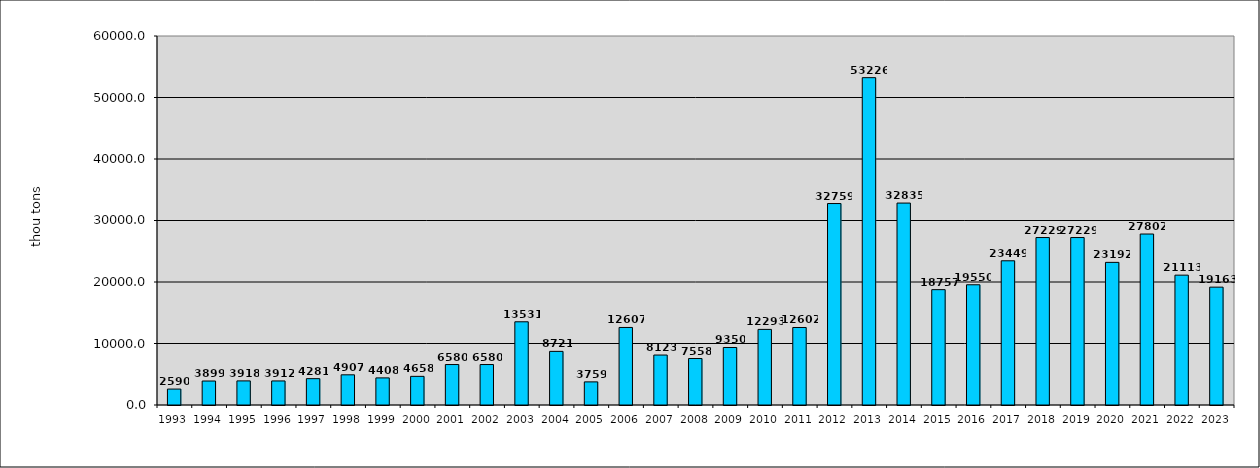
| Category | Series 0 |
|---|---|
| 1993.0 | 2590 |
| 1994.0 | 3899 |
| 1995.0 | 3918 |
| 1996.0 | 3912 |
| 1997.0 | 4281 |
| 1998.0 | 4907 |
| 1999.0 | 4408 |
| 2000.0 | 4658 |
| 2001.0 | 6580 |
| 2002.0 | 6580 |
| 2003.0 | 13531 |
| 2004.0 | 8721 |
| 2005.0 | 3759 |
| 2006.0 | 12607 |
| 2007.0 | 8123 |
| 2008.0 | 7558 |
| 2009.0 | 9350 |
| 2010.0 | 12293 |
| 2011.0 | 12602 |
| 2012.0 | 32759 |
| 2013.0 | 53226 |
| 2014.0 | 32835 |
| 2015.0 | 18757 |
| 2016.0 | 19550 |
| 2017.0 | 23449 |
| 2018.0 | 27229 |
| 2019.0 | 27229 |
| 2020.0 | 23192 |
| 2021.0 | 27802 |
| 2022.0 | 21113 |
| 2023.0 | 19163 |